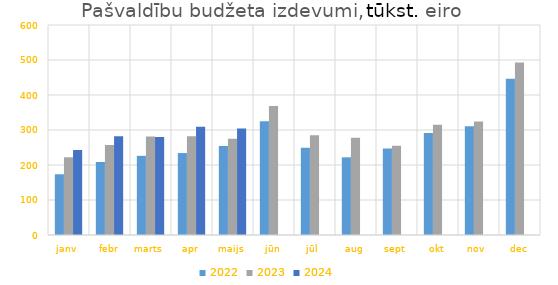
| Category | 2022 | 2023 | 2024 |
|---|---|---|---|
| janv | 173548.423 | 221986.169 | 243159.273 |
| febr | 208650.357 | 257310.25 | 282000.26 |
| marts | 226166.321 | 281685.717 | 280186.85 |
| apr | 234145.666 | 282101.213 | 309610.596 |
| maijs | 253995.943 | 274959.68 | 304271.221 |
| jūn | 325201.018 | 368738.502 | 0 |
| jūl | 249623.438 | 285193.851 | 0 |
| aug | 221979.814 | 277676.465 | 0 |
| sept | 247335.901 | 255025.415 | 0 |
| okt | 291387.208 | 315119.239 | 0 |
| nov | 310697.322 | 324385.045 | 0 |
| dec | 446706.592 | 492764.721 | 0 |